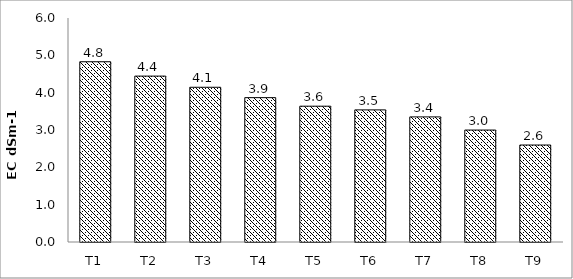
| Category | Series 0 |
|---|---|
| T1 | 4.828 |
| T2 | 4.444 |
| T3 | 4.144 |
| T4 | 3.867 |
| T5 | 3.638 |
| T6 | 3.539 |
| T7 | 3.351 |
| T8 | 2.998 |
| T9 | 2.598 |